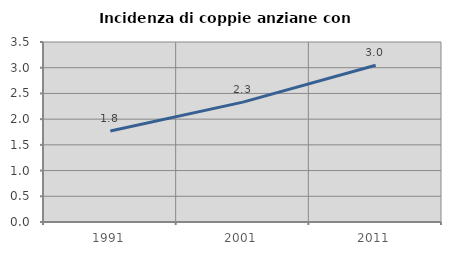
| Category | Incidenza di coppie anziane con figli |
|---|---|
| 1991.0 | 1.769 |
| 2001.0 | 2.331 |
| 2011.0 | 3.047 |